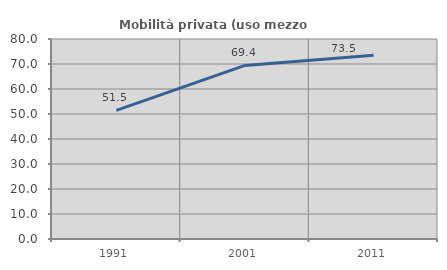
| Category | Mobilità privata (uso mezzo privato) |
|---|---|
| 1991.0 | 51.477 |
| 2001.0 | 69.432 |
| 2011.0 | 73.455 |